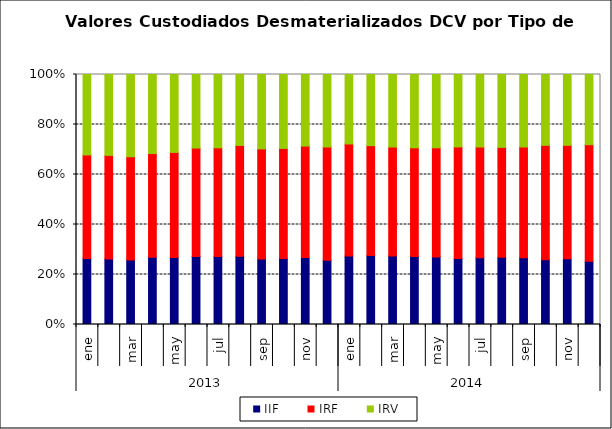
| Category | IIF | IRF | IRV |
|---|---|---|---|
| 0 | 1675.661 | 2623.433 | 2040.209 |
| 1 | 1653.38 | 2610.269 | 2039.052 |
| 2 | 1625.654 | 2597.812 | 2068.804 |
| 3 | 1714.816 | 2648.442 | 2017.792 |
| 4 | 1706.556 | 2670.19 | 1981.652 |
| 5 | 1708.057 | 2721.259 | 1846.579 |
| 6 | 1700.223 | 2719.153 | 1834.309 |
| 7 | 1691.581 | 2748.09 | 1758.669 |
| 8 | 1652.698 | 2771.402 | 1874.421 |
| 9 | 1658.715 | 2769.674 | 1859.962 |
| 10 | 1673.399 | 2789.673 | 1790.218 |
| 11 | 1579.011 | 2781.284 | 1781.214 |
| 12 | 1685.081 | 2762.731 | 1711.633 |
| 13 | 1732.193 | 2760.863 | 1787.756 |
| 14 | 1714.333 | 2724.253 | 1814.882 |
| 15 | 1710.591 | 2732.637 | 1843.591 |
| 16 | 1701.759 | 2758.911 | 1850.323 |
| 17 | 1658.659 | 2796.814 | 1817.341 |
| 18 | 1697.963 | 2808.252 | 1842.196 |
| 19 | 1727.945 | 2823.108 | 1872.893 |
| 20 | 1724.487 | 2860.277 | 1873.636 |
| 21 | 1676.511 | 2966.03 | 1834.205 |
| 22 | 1728.497 | 2986.128 | 1863.237 |
| 23 | 1628.306 | 3008.797 | 1808.275 |